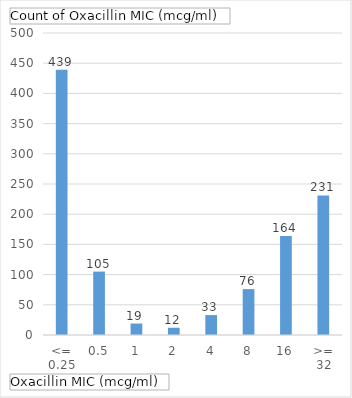
| Category | Total |
|---|---|
| <= 0.25 | 439 |
| 0.5 | 105 |
| 1 | 19 |
| 2 | 12 |
| 4 | 33 |
| 8 | 76 |
| 16 | 164 |
| >= 32 | 231 |